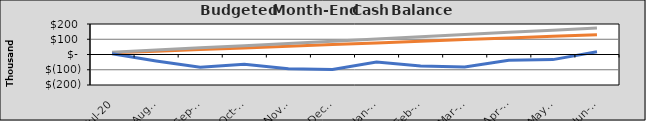
| Category | ORIGINAL CASH | REVISED CASH | FINAL CASH |
|---|---|---|---|
| 2020-07-01 | 10847.568 | 14526.741 | 5604.172 |
| 2020-08-01 | 21695.136 | 29053.483 | -42190.166 |
| 2020-09-01 | 32542.705 | 43580.224 | -84112.461 |
| 2020-10-02 | 43390.273 | 58106.966 | -63461.166 |
| 2020-11-02 | 54237.841 | 72633.707 | -93948.325 |
| 2020-12-03 | 65085.409 | 87160.449 | -98419.64 |
| 2021-01-03 | 75932.978 | 101687.19 | -49246.975 |
| 2021-02-03 | 86780.546 | 116213.931 | -75910.095 |
| 2021-03-06 | 97628.114 | 130740.673 | -81626.96 |
| 2021-04-06 | 108475.682 | 145267.414 | -37253.475 |
| 2021-05-07 | 119323.251 | 159794.156 | -33510.178 |
| 2021-06-07 | 130170.819 | 174320.897 | 18558.24 |